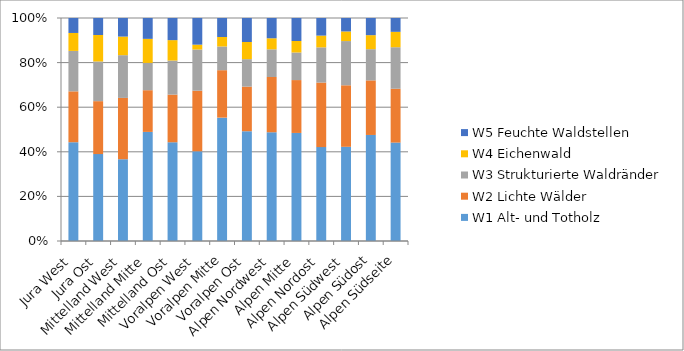
| Category | W1 Alt- und Totholz | W2 Lichte Wälder | W3 Strukturierte Waldränder | W4 Eichenwald | W5 Feuchte Waldstellen |
|---|---|---|---|---|---|
| Jura West | 66 | 34 | 27 | 12 | 10 |
| Jura Ost | 46 | 28 | 21 | 14 | 9 |
| Mittelland West | 44 | 33 | 23 | 10 | 10 |
| Mittelland Mitte | 68 | 26 | 17 | 15 | 13 |
| Mittelland Ost | 58 | 28 | 20 | 12 | 13 |
| Voralpen West | 37 | 25 | 17 | 2 | 11 |
| Voralpen Mitte | 78 | 30 | 15 | 6 | 12 |
| Voralpen Ost | 64 | 26 | 16 | 10 | 14 |
| Alpen Nordwest | 59 | 30 | 15 | 6 | 11 |
| Alpen Mitte | 47 | 23 | 12 | 5 | 10 |
| Alpen Nordost | 32 | 22 | 12 | 4 | 6 |
| Alpen Südwest | 49 | 32 | 23 | 5 | 7 |
| Alpen Südost | 68 | 35 | 20 | 9 | 11 |
| Alpen Südseite | 64 | 35 | 27 | 10 | 9 |